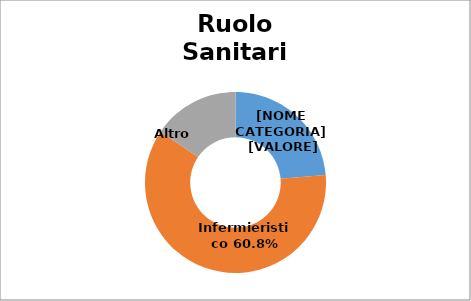
| Category | Series 0 |
|---|---|
| Medici e Odontoiatri | 0.237 |
| Infermieristico | 0.608 |
| Altro  | 0.155 |